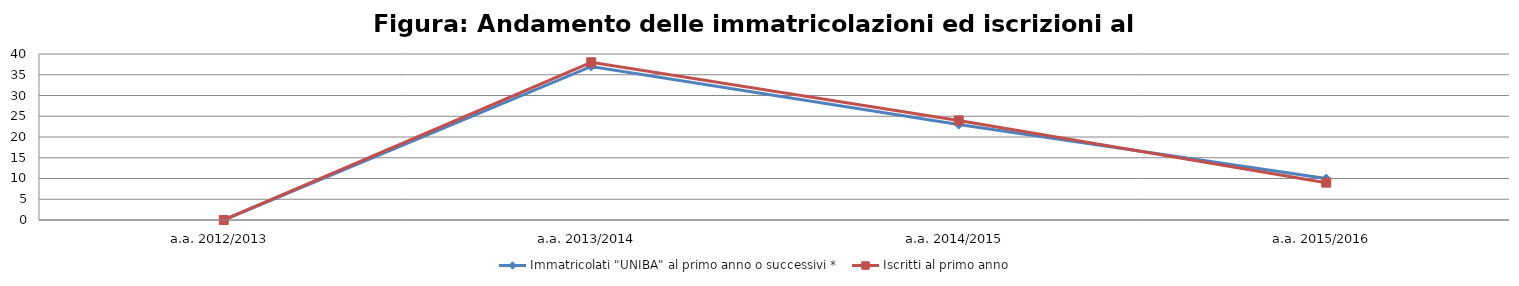
| Category | Immatricolati "UNIBA" al primo anno o successivi * | Iscritti al primo anno  |
|---|---|---|
| a.a. 2012/2013 | 0 | 0 |
| a.a. 2013/2014 | 37 | 38 |
| a.a. 2014/2015 | 23 | 24 |
| a.a. 2015/2016 | 10 | 9 |